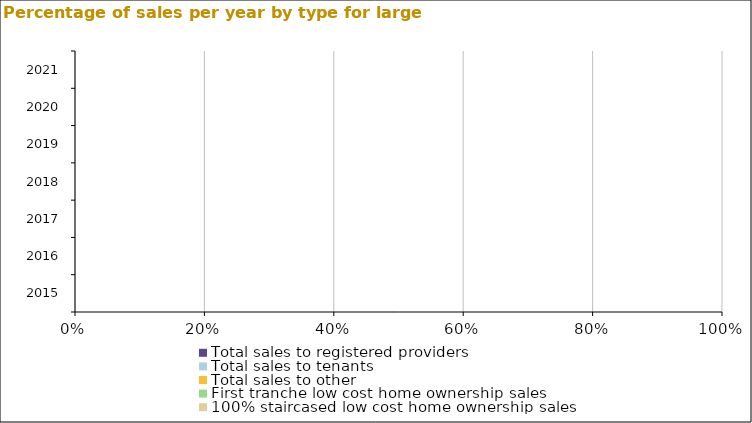
| Category | Total sales to registered providers | Total sales to tenants | Total sales to other | First tranche low cost home ownership sales | 100% staircased low cost home ownership sales |
|---|---|---|---|---|---|
| 2015.0 | 0 | 0 | 0 | 0 | 0 |
| 2016.0 | 0 | 0 | 0 | 0 | 0 |
| 2017.0 | 0 | 0 | 0 | 0 | 0 |
| 2018.0 | 0 | 0 | 0 | 0 | 0 |
| 2019.0 | 0 | 0 | 0 | 0 | 0 |
| 2020.0 | 0 | 0 | 0 | 0 | 0 |
| 2021.0 | 0 | 0 | 0 | 0 | 0 |